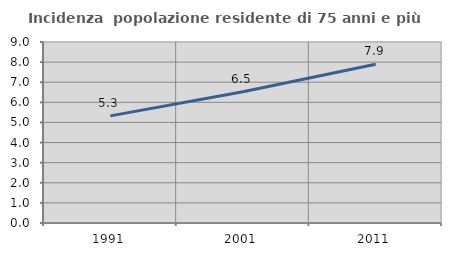
| Category | Incidenza  popolazione residente di 75 anni e più |
|---|---|
| 1991.0 | 5.327 |
| 2001.0 | 6.53 |
| 2011.0 | 7.889 |